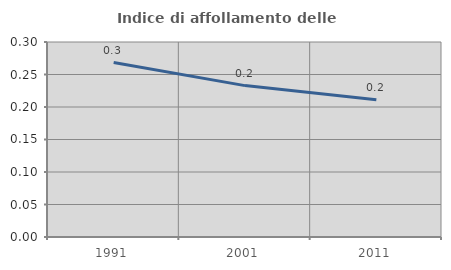
| Category | Indice di affollamento delle abitazioni  |
|---|---|
| 1991.0 | 0.268 |
| 2001.0 | 0.233 |
| 2011.0 | 0.211 |